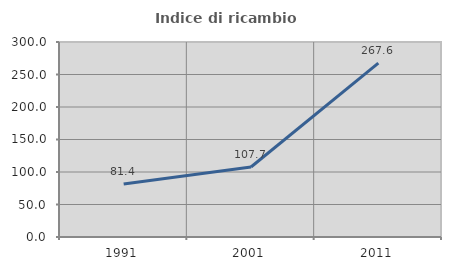
| Category | Indice di ricambio occupazionale  |
|---|---|
| 1991.0 | 81.416 |
| 2001.0 | 107.692 |
| 2011.0 | 267.568 |